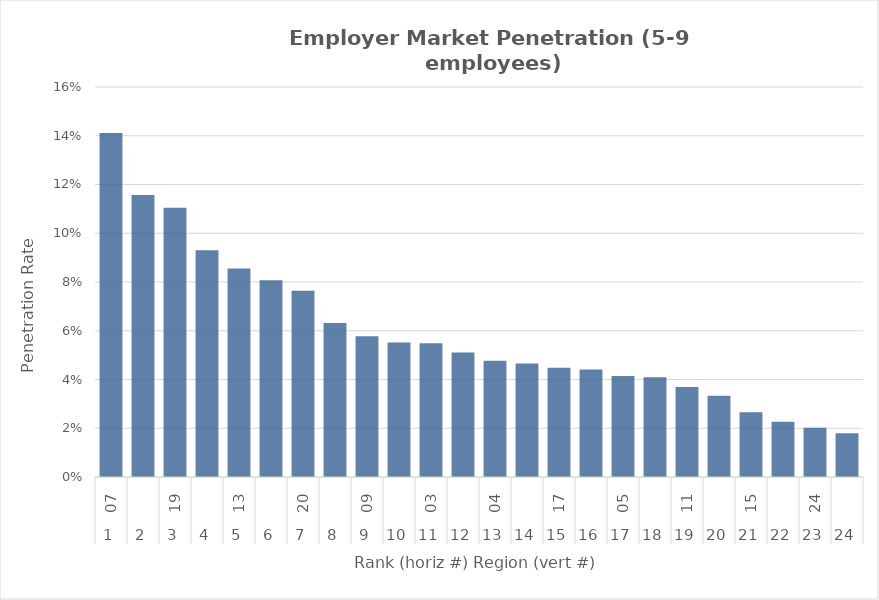
| Category | Rate |
|---|---|
| 0 | 0.141 |
| 1 | 0.116 |
| 2 | 0.111 |
| 3 | 0.093 |
| 4 | 0.086 |
| 5 | 0.081 |
| 6 | 0.076 |
| 7 | 0.063 |
| 8 | 0.058 |
| 9 | 0.055 |
| 10 | 0.055 |
| 11 | 0.051 |
| 12 | 0.048 |
| 13 | 0.047 |
| 14 | 0.045 |
| 15 | 0.044 |
| 16 | 0.041 |
| 17 | 0.041 |
| 18 | 0.037 |
| 19 | 0.033 |
| 20 | 0.027 |
| 21 | 0.023 |
| 22 | 0.02 |
| 23 | 0.018 |